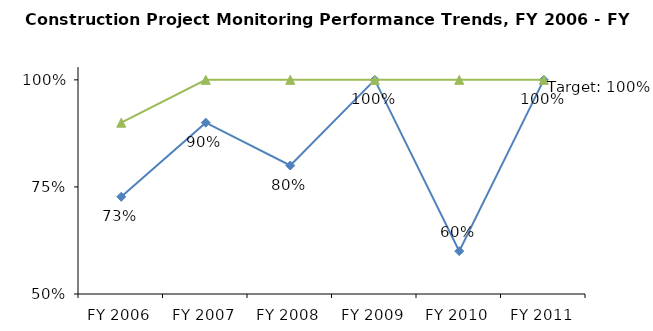
| Category | Result | Target |
|---|---|---|
| FY 2006 | 0.727 | 0.9 |
| FY 2007 | 0.9 | 1 |
| FY 2008 | 0.8 | 1 |
| FY 2009 | 1 | 1 |
| FY 2010 | 0.6 | 1 |
| FY 2011 | 1 | 1 |